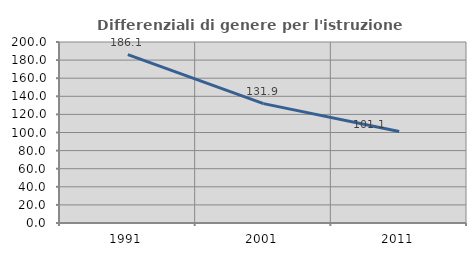
| Category | Differenziali di genere per l'istruzione superiore |
|---|---|
| 1991.0 | 186.057 |
| 2001.0 | 131.932 |
| 2011.0 | 101.112 |